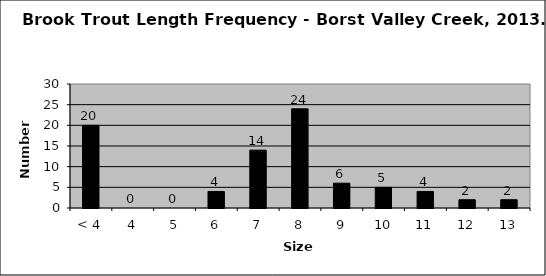
| Category | Series 0 |
|---|---|
| < 4 | 20 |
| 4 | 0 |
| 5 | 0 |
| 6 | 4 |
| 7 | 14 |
| 8 | 24 |
| 9 | 6 |
| 10 | 5 |
| 11 | 4 |
| 12 | 2 |
| 13 | 2 |